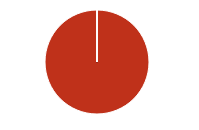
| Category | Total |
|---|---|
| Y | 0 |
| R | 0 |
| T | 0 |
| M | 0 |
| F | 0 |
| N | 177 |